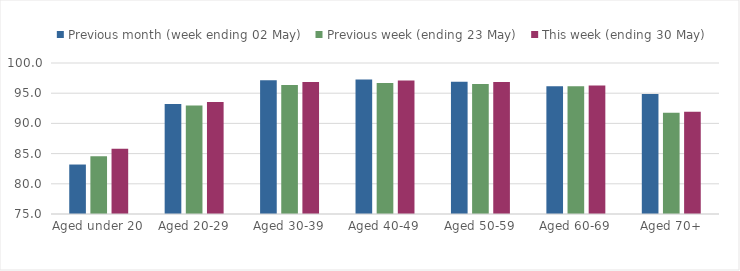
| Category | Previous month (week ending 02 May) | Previous week (ending 23 May) | This week (ending 30 May) |
|---|---|---|---|
| Aged under 20 | 83.192 | 84.569 | 85.806 |
| Aged 20-29 | 93.229 | 92.981 | 93.554 |
| Aged 30-39 | 97.164 | 96.364 | 96.862 |
| Aged 40-49 | 97.249 | 96.677 | 97.082 |
| Aged 50-59 | 96.915 | 96.528 | 96.865 |
| Aged 60-69 | 96.158 | 96.168 | 96.259 |
| Aged 70+ | 94.87 | 91.771 | 91.917 |